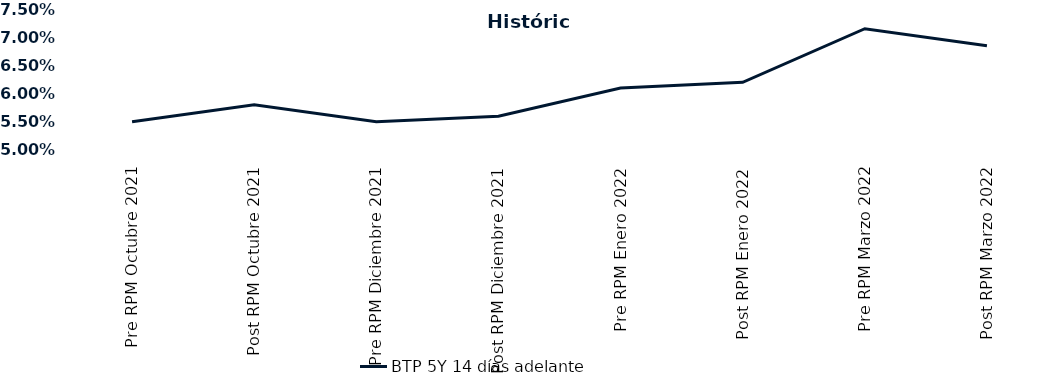
| Category | BTP 5Y 14 días adelante |
|---|---|
| Pre RPM Octubre 2021 | 0.055 |
| Post RPM Octubre 2021 | 0.058 |
| Pre RPM Diciembre 2021 | 0.055 |
| Post RPM Diciembre 2021 | 0.056 |
| Pre RPM Enero 2022 | 0.061 |
| Post RPM Enero 2022 | 0.062 |
| Pre RPM Marzo 2022 | 0.072 |
| Post RPM Marzo 2022 | 0.068 |